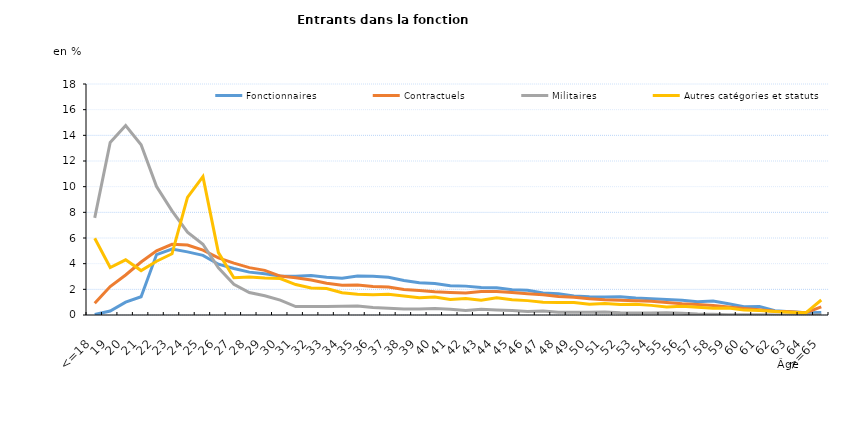
| Category | Fonctionnaires | Contractuels | Militaires | Autres catégories et statuts |
|---|---|---|---|---|
| <=18 | 0.04 | 0.91 | 7.57 | 5.98 |
| 19 | 0.31 | 2.22 | 13.44 | 3.7 |
| 20 | 1 | 3.12 | 14.77 | 4.3 |
| 21 | 1.42 | 4.13 | 13.27 | 3.46 |
| 22 | 4.71 | 5 | 10.01 | 4.19 |
| 23 | 5.14 | 5.51 | 8.11 | 4.77 |
| 24 | 4.92 | 5.45 | 6.46 | 9.17 |
| 25 | 4.65 | 5.05 | 5.51 | 10.78 |
| 26 | 3.96 | 4.45 | 3.67 | 4.86 |
| 27 | 3.62 | 4.04 | 2.4 | 2.9 |
| 28 | 3.34 | 3.69 | 1.75 | 2.96 |
| 29 | 3.21 | 3.48 | 1.5 | 2.88 |
| 30 | 3.04 | 3.03 | 1.16 | 2.84 |
| 31 | 3.01 | 2.9 | 0.66 | 2.37 |
| 32 | 3.08 | 2.73 | 0.66 | 2.11 |
| 33 | 2.94 | 2.48 | 0.66 | 2.06 |
| 34 | 2.87 | 2.32 | 0.68 | 1.74 |
| 35 | 3.04 | 2.33 | 0.71 | 1.62 |
| 36 | 3.02 | 2.23 | 0.58 | 1.57 |
| 37 | 2.94 | 2.18 | 0.52 | 1.62 |
| 38 | 2.69 | 1.99 | 0.46 | 1.48 |
| 39 | 2.52 | 1.9 | 0.47 | 1.34 |
| 40 | 2.45 | 1.81 | 0.5 | 1.4 |
| 41 | 2.28 | 1.76 | 0.45 | 1.21 |
| 42 | 2.25 | 1.71 | 0.36 | 1.29 |
| 43 | 2.15 | 1.83 | 0.44 | 1.15 |
| 44 | 2.13 | 1.84 | 0.39 | 1.35 |
| 45 | 1.96 | 1.75 | 0.35 | 1.18 |
| 46 | 1.92 | 1.66 | 0.28 | 1.12 |
| 47 | 1.71 | 1.57 | 0.32 | 0.99 |
| 48 | 1.66 | 1.44 | 0.22 | 0.97 |
| 49 | 1.49 | 1.39 | 0.22 | 0.98 |
| 50 | 1.42 | 1.27 | 0.22 | 0.84 |
| 51 | 1.41 | 1.19 | 0.23 | 0.9 |
| 52 | 1.43 | 1.14 | 0.17 | 0.82 |
| 53 | 1.33 | 1.11 | 0.16 | 0.83 |
| 54 | 1.26 | 1.07 | 0.16 | 0.75 |
| 55 | 1.2 | 0.97 | 0.18 | 0.63 |
| 56 | 1.14 | 0.88 | 0.13 | 0.68 |
| 57 | 1.04 | 0.82 | 0.07 | 0.6 |
| 58 | 1.09 | 0.74 | 0.05 | 0.52 |
| 59 | 0.88 | 0.63 | 0.02 | 0.54 |
| 60 | 0.65 | 0.51 | 0.02 | 0.38 |
| 61 | 0.66 | 0.41 | 0.01 | 0.35 |
| 62 | 0.34 | 0.29 | 0 | 0.28 |
| 63 | 0.26 | 0.25 | 0 | 0.22 |
| 64 | 0.18 | 0.18 | 0 | 0.17 |
| >=65 | 0.19 | 0.64 | 0.01 | 1.17 |